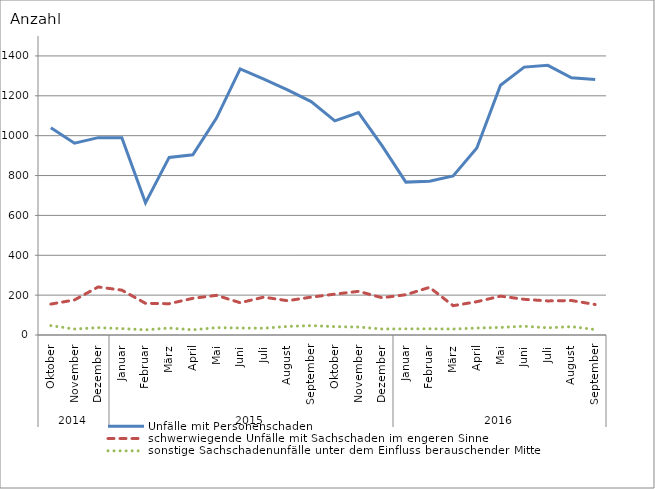
| Category | Unfälle mit Personenschaden | schwerwiegende Unfälle mit Sachschaden im engeren Sinne | sonstige Sachschadenunfälle unter dem Einfluss berauschender Mittel |
|---|---|---|---|
| 0 | 1040 | 155 | 47 |
| 1 | 962 | 176 | 30 |
| 2 | 990 | 241 | 37 |
| 3 | 990 | 225 | 32 |
| 4 | 663 | 159 | 26 |
| 5 | 891 | 157 | 35 |
| 6 | 904 | 184 | 26 |
| 7 | 1088 | 199 | 37 |
| 8 | 1335 | 162 | 35 |
| 9 | 1284 | 190 | 34 |
| 10 | 1230 | 172 | 43 |
| 11 | 1171 | 190 | 47 |
| 12 | 1074 | 205 | 42 |
| 13 | 1116 | 219 | 40 |
| 14 | 949 | 187 | 30 |
| 15 | 767 | 202 | 31 |
| 16 | 771 | 239 | 31 |
| 17 | 798 | 147 | 30 |
| 18 | 938 | 167 | 35 |
| 19 | 1253 | 195 | 38 |
| 20 | 1344 | 179 | 44 |
| 21 | 1353 | 171 | 36 |
| 22 | 1290 | 173 | 42 |
| 23 | 1282 | 153 | 27 |